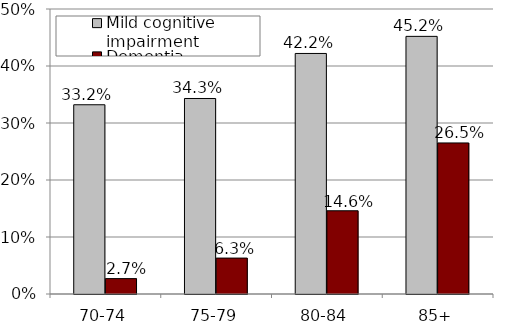
| Category | Mild cognitive impairment | Dementia |
|---|---|---|
| 70-74 | 0.332 | 0.027 |
| 75-79 | 0.343 | 0.063 |
| 80-84 | 0.422 | 0.146 |
| 85+ | 0.452 | 0.265 |